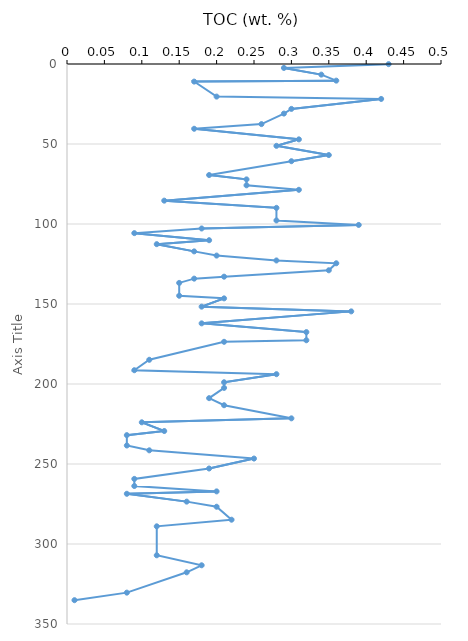
| Category | Series 0 |
|---|---|
| 0.43 | 0.09 |
| 0.29 | 2.45 |
| 0.34 | 6.64 |
| 0.36 | 10.4 |
| 0.17 | 11 |
| 0.2 | 20.37 |
| 0.42 | 21.84 |
| 0.3 | 28.06 |
| 0.29 | 30.99 |
| 0.26 | 37.56 |
| 0.17 | 40.48 |
| 0.31 | 47.1 |
| 0.28 | 51.15 |
| 0.35 | 56.91 |
| 0.3 | 60.75 |
| 0.19 | 69.4 |
| 0.24 | 72.11 |
| 0.24 | 75.82 |
| 0.31 | 78.63 |
| 0.13 | 85.41 |
| 0.28 | 89.91 |
| 0.28 | 97.78 |
| 0.39 | 100.59 |
| 0.18 | 102.8 |
| 0.09 | 105.71 |
| 0.19 | 110.13 |
| 0.12 | 112.6 |
| 0.17 | 117.11 |
| 0.2 | 119.74 |
| 0.28 | 122.79 |
| 0.36 | 124.55 |
| 0.35 | 128.93 |
| 0.21 | 132.92 |
| 0.17 | 134.15 |
| 0.15 | 136.82 |
| 0.15 | 144.84 |
| 0.21 | 146.48 |
| 0.18 | 151.66 |
| 0.38 | 154.61 |
| 0.18 | 162.1 |
| 0.32 | 167.56 |
| 0.32 | 172.66 |
| 0.21 | 173.63 |
| 0.11 | 184.87 |
| 0.09 | 191.39 |
| 0.28 | 193.86 |
| 0.21 | 198.92 |
| 0.21 | 202.43 |
| 0.19 | 208.85 |
| 0.21 | 213.27 |
| 0.3 | 221.46 |
| 0.1 | 223.94 |
| 0.13 | 229.39 |
| 0.08 | 231.96 |
| 0.08 | 238.44 |
| 0.11 | 241.45 |
| 0.25 | 246.6 |
| 0.19 | 252.81 |
| 0.09 | 259.31 |
| 0.09 | 263.76 |
| 0.2 | 267.12 |
| 0.08 | 268.62 |
| 0.16 | 273.52 |
| 0.2 | 276.71 |
| 0.22 | 284.82 |
| 0.12 | 288.95 |
| 0.12 | 307.06 |
| 0.18 | 313.3 |
| 0.16 | 317.7 |
| 0.08 | 330.4 |
| 0.01 | 335.12 |